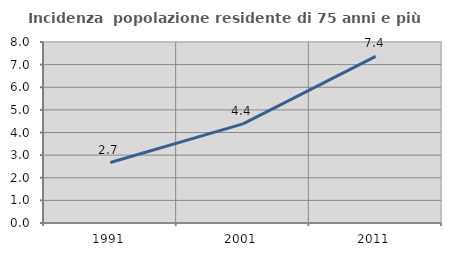
| Category | Incidenza  popolazione residente di 75 anni e più |
|---|---|
| 1991.0 | 2.673 |
| 2001.0 | 4.382 |
| 2011.0 | 7.365 |